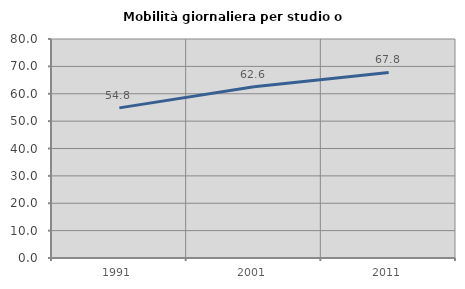
| Category | Mobilità giornaliera per studio o lavoro |
|---|---|
| 1991.0 | 54.836 |
| 2001.0 | 62.578 |
| 2011.0 | 67.769 |